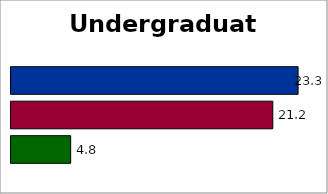
| Category | Series 2 | SREB states | 50 states and D.C. |
|---|---|---|---|
| 0 | 4.842 | 21.249 | 23.304 |